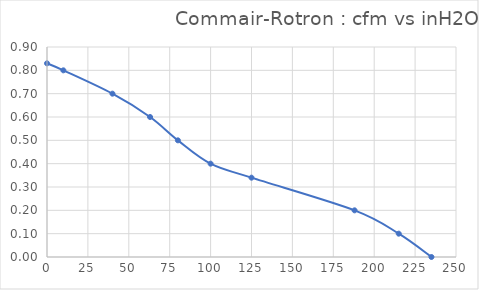
| Category | Series 0 |
|---|---|
| 0.0 | 0.83 |
| 10.0 | 0.8 |
| 40.0 | 0.7 |
| 63.0 | 0.6 |
| 80.0 | 0.5 |
| 100.0 | 0.4 |
| 125.0 | 0.34 |
| 188.0 | 0.2 |
| 215.0 | 0.1 |
| 235.0 | 0 |